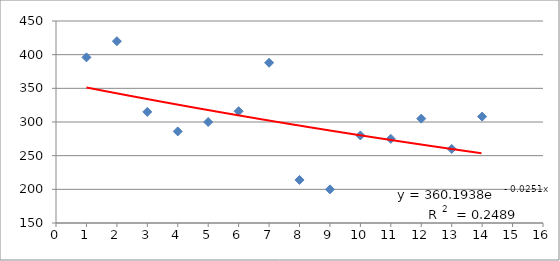
| Category | Series 0 |
|---|---|
| 1.0 | 396 |
| 2.0 | 420 |
| 3.0 | 315 |
| 4.0 | 286 |
| 5.0 | 300 |
| 6.0 | 316 |
| 7.0 | 388 |
| 8.0 | 214 |
| 9.0 | 200 |
| 10.0 | 280 |
| 11.0 | 275 |
| 12.0 | 305 |
| 13.0 | 260 |
| 14.0 | 308 |